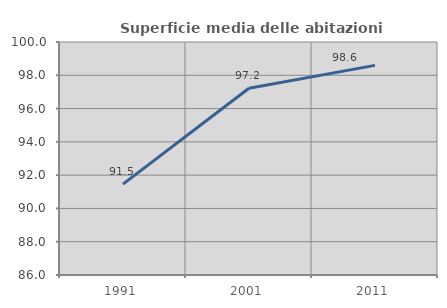
| Category | Superficie media delle abitazioni occupate |
|---|---|
| 1991.0 | 91.458 |
| 2001.0 | 97.218 |
| 2011.0 | 98.595 |